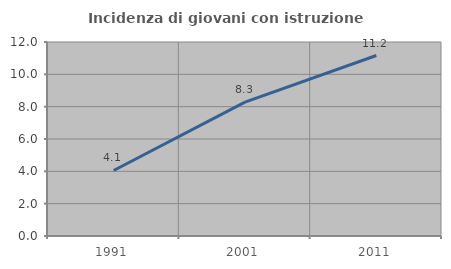
| Category | Incidenza di giovani con istruzione universitaria |
|---|---|
| 1991.0 | 4.054 |
| 2001.0 | 8.286 |
| 2011.0 | 11.163 |